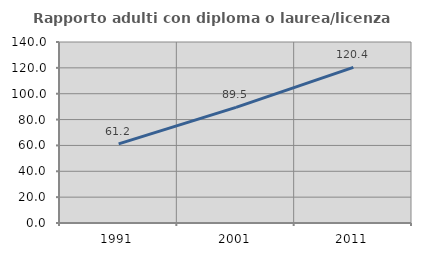
| Category | Rapporto adulti con diploma o laurea/licenza media  |
|---|---|
| 1991.0 | 61.233 |
| 2001.0 | 89.474 |
| 2011.0 | 120.401 |